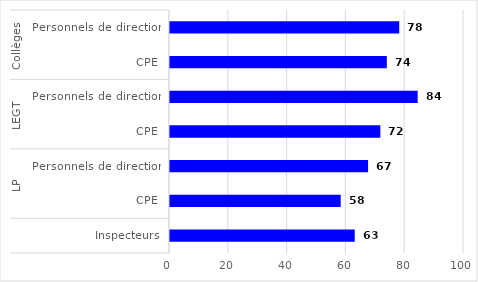
| Category | Series 0 |
|---|---|
| 0 | 77.973 |
| 1 | 73.743 |
| 2 | 84.241 |
| 3 | 71.545 |
| 4 | 67.374 |
| 5 | 58.057 |
| 6 | 62.843 |